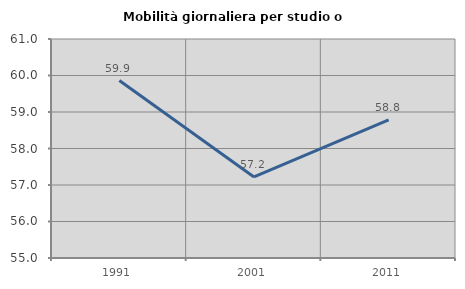
| Category | Mobilità giornaliera per studio o lavoro |
|---|---|
| 1991.0 | 59.863 |
| 2001.0 | 57.22 |
| 2011.0 | 58.783 |